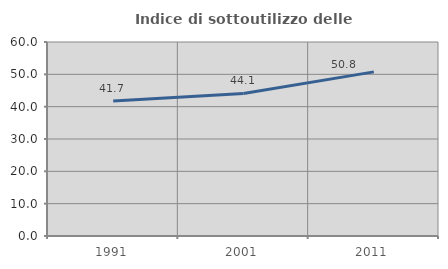
| Category | Indice di sottoutilizzo delle abitazioni  |
|---|---|
| 1991.0 | 41.739 |
| 2001.0 | 44.094 |
| 2011.0 | 50.758 |